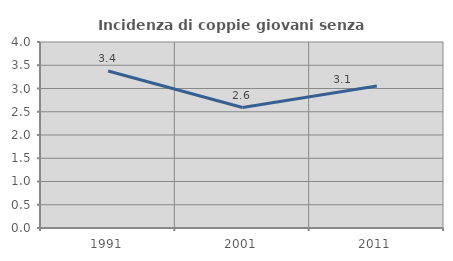
| Category | Incidenza di coppie giovani senza figli |
|---|---|
| 1991.0 | 3.377 |
| 2001.0 | 2.591 |
| 2011.0 | 3.052 |